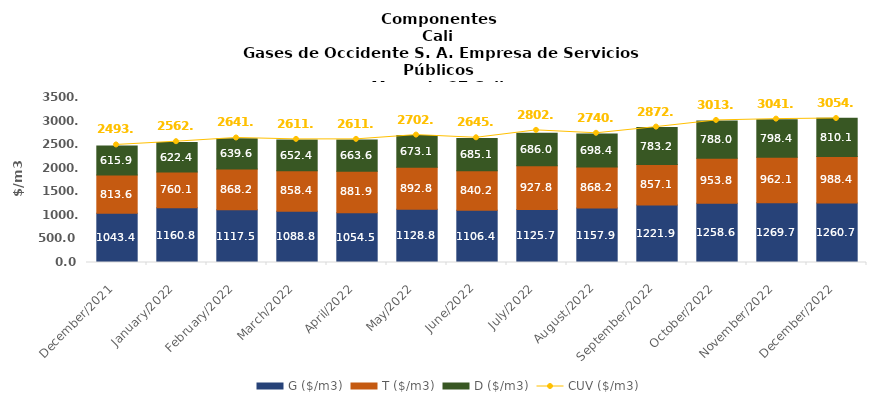
| Category | G ($/m3) | T ($/m3) | D ($/m3) |
|---|---|---|---|
| 2021-12-01 | 1043.37 | 813.62 | 615.9 |
| 2022-01-01 | 1160.8 | 760.12 | 622.38 |
| 2022-02-01 | 1117.53 | 868.17 | 639.61 |
| 2022-03-01 | 1088.76 | 858.37 | 652.41 |
| 2022-04-01 | 1054.54 | 881.94 | 663.62 |
| 2022-05-01 | 1128.76 | 892.81 | 673.08 |
| 2022-06-01 | 1106.43 | 840.15 | 685.1 |
| 2022-07-01 | 1125.65 | 927.75 | 685.99 |
| 2022-08-01 | 1157.9 | 868.22 | 698.36 |
| 2022-09-01 | 1221.85 | 857.06 | 783.19 |
| 2022-10-01 | 1258.64 | 953.77 | 787.98 |
| 2022-11-01 | 1269.65 | 962.1 | 798.39 |
| 2022-12-01 | 1260.7 | 988.43 | 810.07 |